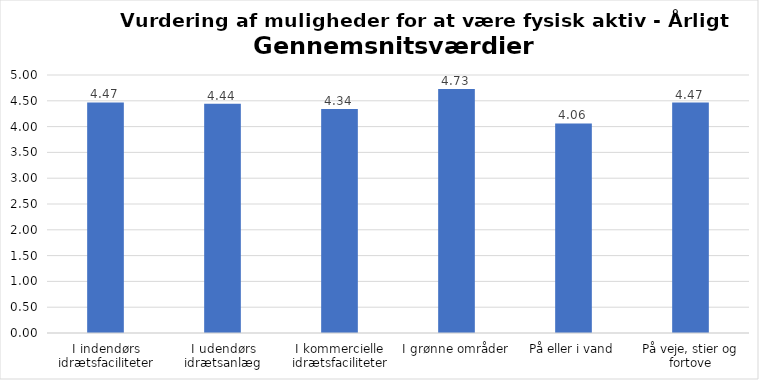
| Category | Gennemsnit |
|---|---|
| I indendørs idrætsfaciliteter | 4.468 |
| I udendørs idrætsanlæg | 4.443 |
| I kommercielle idrætsfaciliteter | 4.343 |
| I grønne områder | 4.727 |
| På eller i vand | 4.06 |
| På veje, stier og fortove | 4.467 |